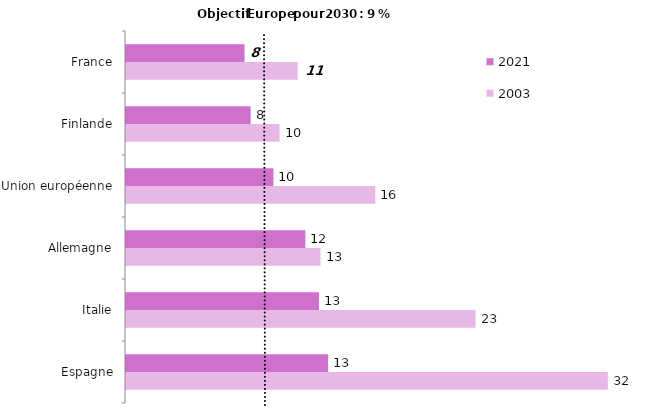
| Category | 2003 | 2021 |
|---|---|---|
| Espagne | 31.7 | 13.3 |
| Italie | 23 | 12.7 |
| Allemagne | 12.8 | 11.8 |
| Union européenne | 16.4 | 9.7 |
| Finlande | 10.1 | 8.2 |
| France | 11.3 | 7.8 |